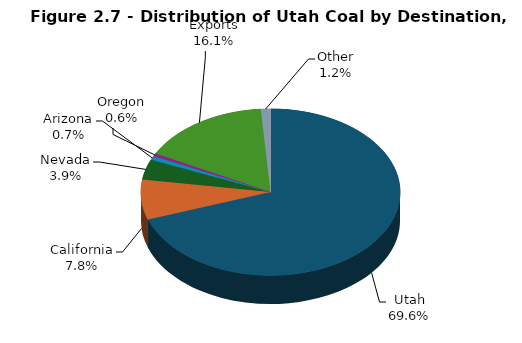
| Category | Series 0 |
|---|---|
| Utah | 12417 |
| California | 1387 |
| Nevada | 701 |
| Arizona | 128 |
| Oregon | 112 |
| Exports | 2869 |
| Other | 214 |